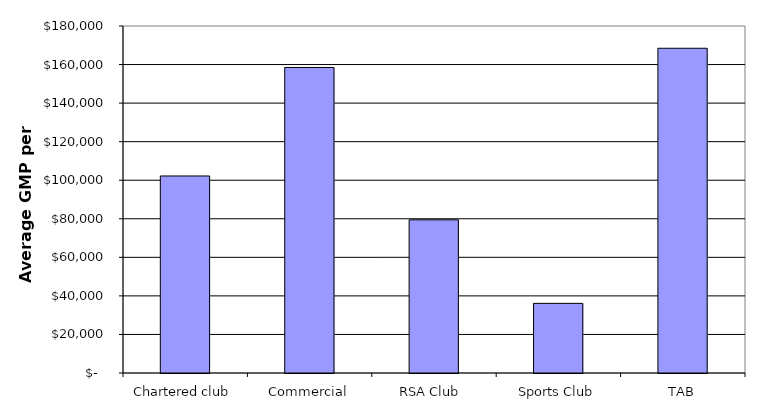
| Category | Series 0 |
|---|---|
| Chartered club | 102203.371 |
| Commercial | 158487.436 |
| RSA Club  | 79458.827 |
| Sports Club | 36127.702 |
| TAB | 168453.742 |